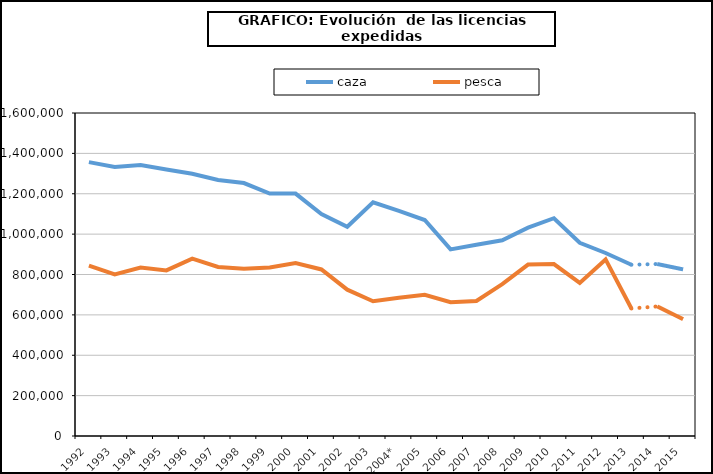
| Category | caza | pesca |
|---|---|---|
| 1992 | 1356553 | 844299 |
| 1993 | 1332252 | 799990 |
| 1994 | 1342603 | 834085 |
| 1995 | 1320315 | 820252 |
| 1996 | 1298860 | 878282 |
| 1997 | 1268057 | 837092 |
| 1998 | 1253105 | 829083 |
| 1999 | 1200951 | 834680 |
| 2000 | 1200875 | 856450 |
| 2001 | 1099856 | 825020 |
| 2002 | 1036340 | 724800 |
| 2003 | 1157969 | 667655 |
| 2004* | 1115000 | 685000 |
| 2005 | 1069804 | 699078 |
| 2006 | 924524 | 663000 |
| 2007 | 946965 | 668685 |
| 2008 | 969298 | 751937 |
| 2009 | 1032242 | 849102 |
| 2010 | 1078852 | 851759 |
| 2011 | 957191 | 758018 |
| 2012 | 906437 | 874802 |
| 2013 | 848243 | 631643 |
| 2014 | 851894 | 641819 |
| 2015 | 825374 | 578707 |